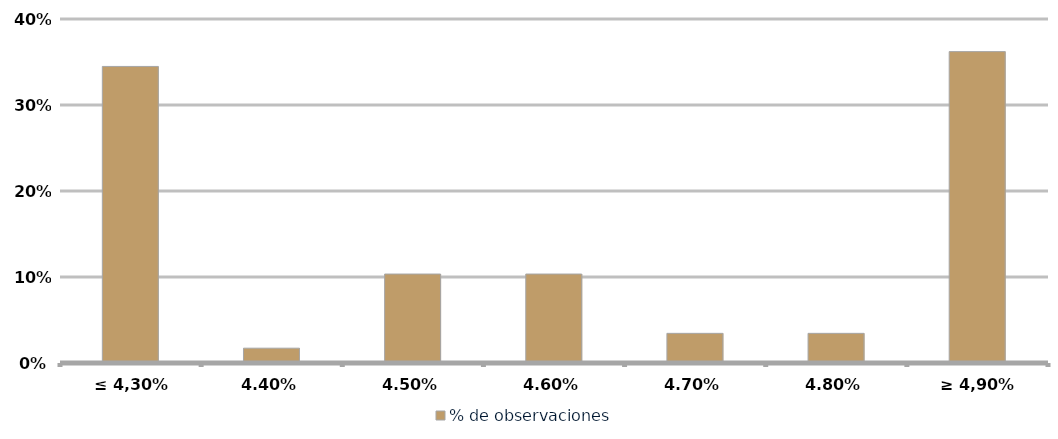
| Category | % de observaciones  |
|---|---|
| ≤ 4,30% | 0.345 |
| 4,40% | 0.017 |
| 4,50% | 0.103 |
| 4,60% | 0.103 |
| 4,70% | 0.034 |
| 4,80% | 0.034 |
| ≥ 4,90% | 0.362 |